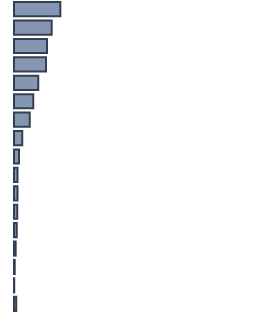
| Category | Percentatge |
|---|---|
| 0 | 19.3 |
| 1 | 15.7 |
| 2 | 13.8 |
| 3 | 13.3 |
| 4 | 10.1 |
| 5 | 8 |
| 6 | 6.6 |
| 7 | 3.4 |
| 8 | 2.1 |
| 9 | 1.5 |
| 10 | 1.5 |
| 11 | 1.4 |
| 12 | 1.1 |
| 13 | 0.7 |
| 14 | 0.3 |
| 15 | 0.1 |
| 16 | 0.985 |